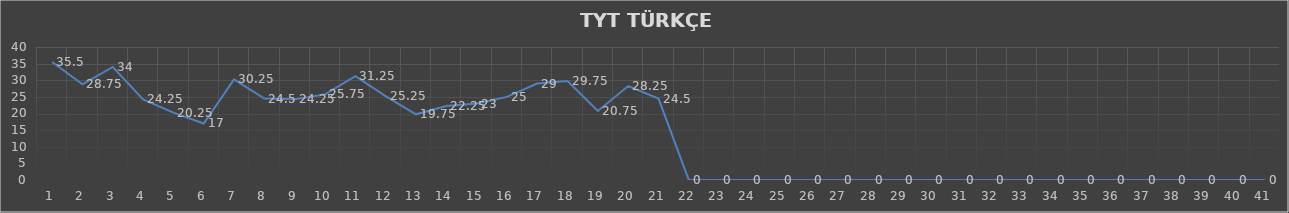
| Category | Series 0 |
|---|---|
| 0 | 35.5 |
| 1 | 28.75 |
| 2 | 34 |
| 3 | 24.25 |
| 4 | 20.25 |
| 5 | 17 |
| 6 | 30.25 |
| 7 | 24.5 |
| 8 | 24.25 |
| 9 | 25.75 |
| 10 | 31.25 |
| 11 | 25.25 |
| 12 | 19.75 |
| 13 | 22.25 |
| 14 | 23 |
| 15 | 25 |
| 16 | 29 |
| 17 | 29.75 |
| 18 | 20.75 |
| 19 | 28.25 |
| 20 | 24.5 |
| 21 | 0 |
| 22 | 0 |
| 23 | 0 |
| 24 | 0 |
| 25 | 0 |
| 26 | 0 |
| 27 | 0 |
| 28 | 0 |
| 29 | 0 |
| 30 | 0 |
| 31 | 0 |
| 32 | 0 |
| 33 | 0 |
| 34 | 0 |
| 35 | 0 |
| 36 | 0 |
| 37 | 0 |
| 38 | 0 |
| 39 | 0 |
| 40 | 0 |